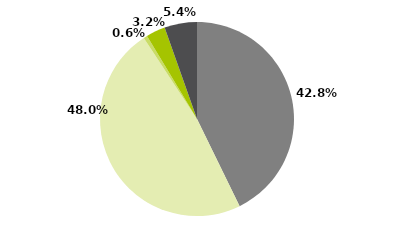
| Category | Series 0 |
|---|---|
| Multimercados Macro | 0.428 |
| Multimercados Livre | 0.48 |
| Multimercados L/S - Neutro | 0.006 |
| Multimercados L/S - Direcional | 0.032 |
| Outros | 0.054 |